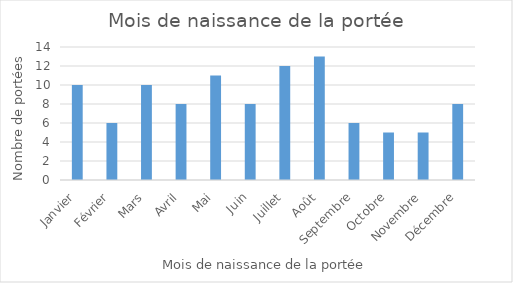
| Category | Series 0 |
|---|---|
| Janvier | 10 |
| Février | 6 |
| Mars | 10 |
| Avril | 8 |
| Mai | 11 |
| Juin | 8 |
| Juillet | 12 |
| Août | 13 |
| Septembre | 6 |
| Octobre | 5 |
| Novembre | 5 |
| Décembre | 8 |